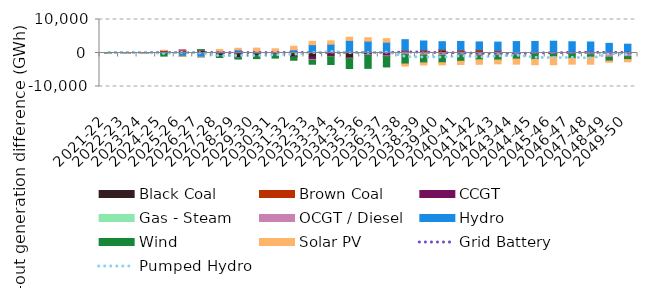
| Category | Black Coal | Brown Coal | CCGT | Gas - Steam | OCGT / Diesel | Hydro | Wind | Solar PV |
|---|---|---|---|---|---|---|---|---|
| 2021-22 | 11.119 | 0 | 0 | 0 | 0 | -13.147 | -0.001 | 0 |
| 2022-23 | 54.616 | 14.273 | 0 | 0 | 0 | -78.21 | -0.001 | -0.003 |
| 2023-24 | 64.982 | -1.349 | 0 | -0.01 | 0 | -75.454 | -0.004 | -0.033 |
| 2024-25 | 503.036 | 263.308 | -11.133 | -2.203 | -4.77 | -276.66 | -635.046 | 0 |
| 2025-26 | 241.386 | 597.05 | 24.776 | -0.168 | 1.73 | -957.601 | -18.59 | 0 |
| 2026-27 | 805.014 | 186.087 | 5.781 | 0.093 | 0.068 | -1249.445 | 0.996 | -0.004 |
| 2027-28 | -823.477 | 58.359 | 0.227 | -1.332 | -0.899 | 482.957 | -515.818 | 517.487 |
| 2028-29 | -1373.577 | 127.056 | -22.9 | -2.582 | -0.241 | 836.118 | -417.342 | 447.976 |
| 2029-30 | -765.868 | 96.568 | 1.823 | 0.69 | 0.506 | 392.049 | -909.012 | 957.62 |
| 2030-31 | -621.737 | 71.138 | 7.492 | -0.672 | 6.537 | 155.706 | -907.118 | 1019.567 |
| 2031-32 | -1146.256 | 266.537 | -2.311 | 0.058 | 1.071 | 701.036 | -1016.154 | 1043.407 |
| 2032-33 | -1199.756 | 265.97 | -849.21 | -62.351 | -71.965 | 2214.713 | -1174.107 | 1007.992 |
| 2033-34 | -606.511 | 361.782 | -451.007 | -36.289 | -47.641 | 2270.731 | -2294.32 | 993.262 |
| 2034-35 | -1406.039 | 341.75 | -169.004 | -76.923 | -64.502 | 3416.178 | -2913.125 | 977.016 |
| 2035-36 | -89.009 | 346.982 | -503.599 | -24.652 | -88.199 | 3177.458 | -3883.738 | 1036.451 |
| 2036-37 | 110.646 | 262.69 | -923.554 | -35.393 | -132.764 | 2863.889 | -3073.871 | 1041.312 |
| 2037-38 | 325.781 | 473.776 | -114.11 | -38.374 | -325.395 | 3175.866 | -2814.704 | -615.665 |
| 2038-39 | 518.574 | 420.368 | -125.802 | -45.128 | -482.281 | 2648.856 | -2301.573 | -620.218 |
| 2039-40 | 672.183 | 430.897 | -40.221 | -0.356 | -650.822 | 2273.945 | -2213.359 | -638.225 |
| 2040-41 | 283.279 | 585.348 | -21.651 | -0.366 | -583.55 | 2580.841 | -1864.043 | -962.65 |
| 2041-42 | 490.597 | 496.09 | -112.02 | -8.454 | -689.303 | 2318.085 | -1220.483 | -1344.687 |
| 2042-43 | 193.597 | 514.07 | -60.276 | -1.942 | -674.066 | 2549.52 | -1361.744 | -1138.963 |
| 2043-44 | -36.075 | -16.621 | -37.017 | -3.041 | -523.462 | 3411.242 | -1199.122 | -1511.267 |
| 2044-45 | -23.212 | 33.989 | -36.755 | -2.607 | -221.771 | 3422.055 | -1625.45 | -1582.129 |
| 2045-46 | 5.757 | 38.115 | -6.065 | -2.48 | -374.958 | 3479.37 | -753.216 | -2366.178 |
| 2046-47 | 11.227 | -3.945 | -0.001 | 0 | -345.423 | 3349.869 | -1259.758 | -1723.086 |
| 2047-48 | 6.563 | -51.287 | -0.001 | 0 | -484.072 | 3281.082 | -722.693 | -2096.153 |
| 2048-49 | 3.297 | 0 | -0.001 | 0 | -1280.643 | 2880.391 | -1132.181 | -349.373 |
| 2049-50 | -12.352 | 0 | -0.001 | 0 | -1078.464 | 2632.316 | -873.75 | -662.768 |